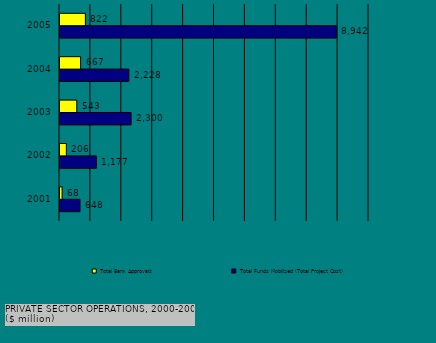
| Category | Total Funds Mobilized (Total Project Cost) | Total Bank Approvals |
|---|---|---|
| 2001.0 | 648 | 67.86 |
| 2002.0 | 1176.6 | 205.526 |
| 2003.0 | 2300 | 542.65 |
| 2004.0 | 2227.7 | 666.9 |
| 2005.0 | 8941.62 | 821.517 |